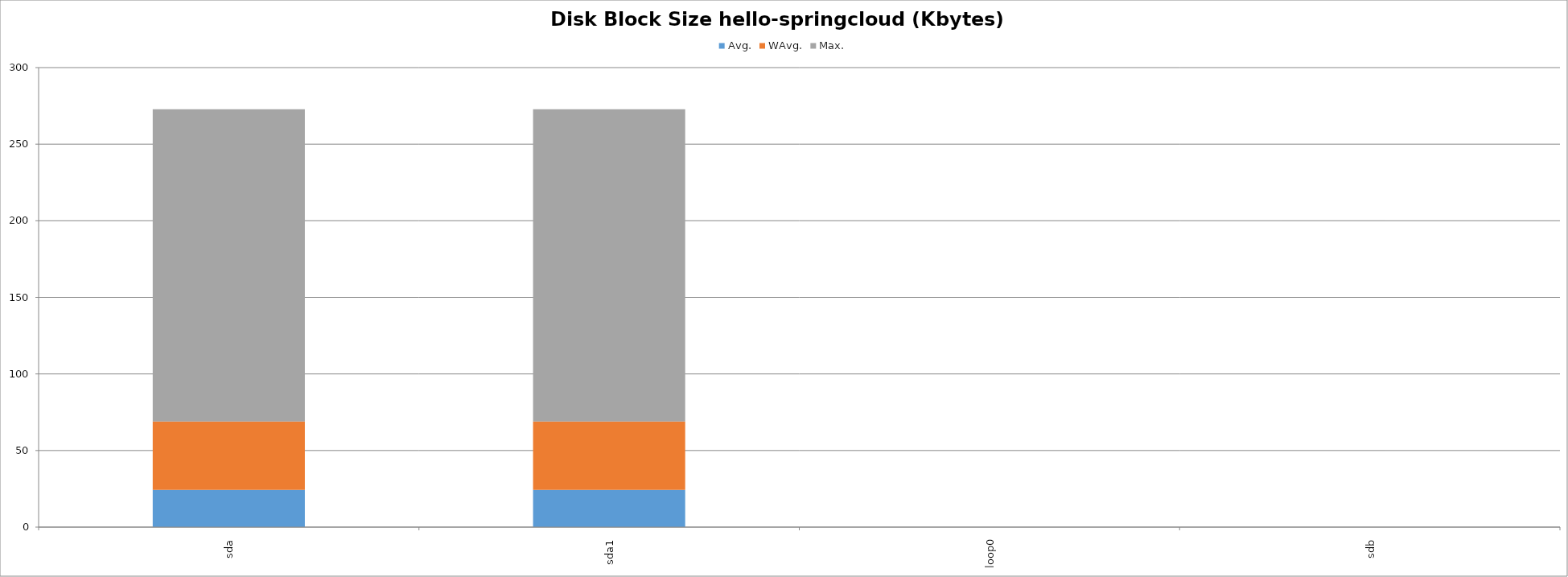
| Category | Avg. | WAvg. | Max. |
|---|---|---|---|
| sda | 24.251 | 44.683 | 203.865 |
| sda1 | 24.251 | 44.683 | 203.865 |
| loop0 | 0 | 0 | 0 |
| sdb | 0 | 0 | 0 |